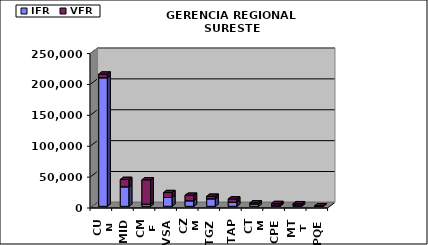
| Category | IFR | VFR |
|---|---|---|
| CUN | 208165 | 5873 |
| MID | 31616 | 11891 |
| CME | 3540 | 39369 |
| VSA | 14272 | 7966 |
| CZM | 9000 | 8898 |
| TGZ | 12197 | 4081 |
| TAP | 6666 | 5320 |
| CTM | 3905 | 1641 |
| CPE | 2272 | 2257 |
| MTT | 2272 | 1949 |
| PQE | 241 | 579 |